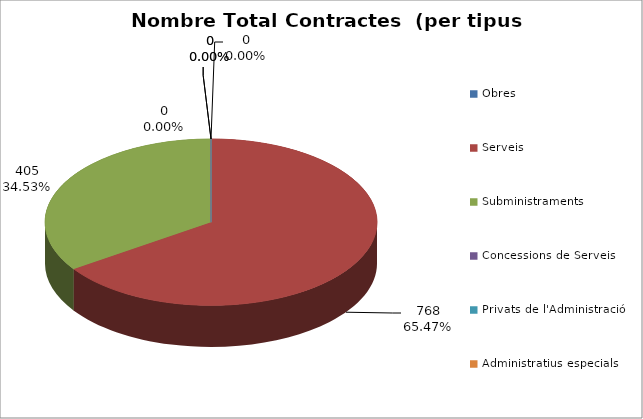
| Category | Nombre Total Contractes |
|---|---|
| Obres | 0 |
| Serveis | 768 |
| Subministraments | 405 |
| Concessions de Serveis | 0 |
| Privats de l'Administració | 0 |
| Administratius especials | 0 |